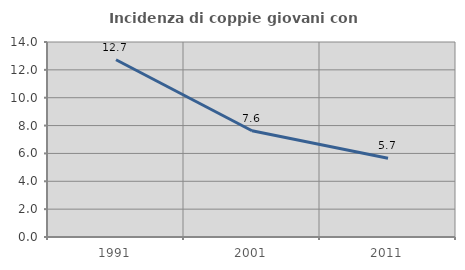
| Category | Incidenza di coppie giovani con figli |
|---|---|
| 1991.0 | 12.727 |
| 2001.0 | 7.627 |
| 2011.0 | 5.66 |